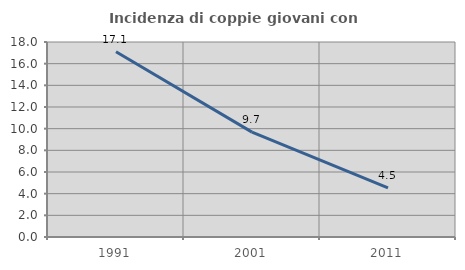
| Category | Incidenza di coppie giovani con figli |
|---|---|
| 1991.0 | 17.098 |
| 2001.0 | 9.677 |
| 2011.0 | 4.525 |